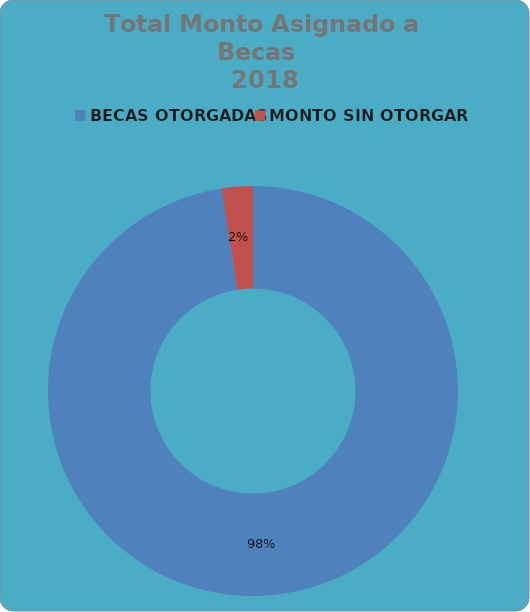
| Category | Series 0 |
|---|---|
| BECAS OTORGADAS | 1239964.295 |
| MONTO SIN OTORGAR | 31015.705 |